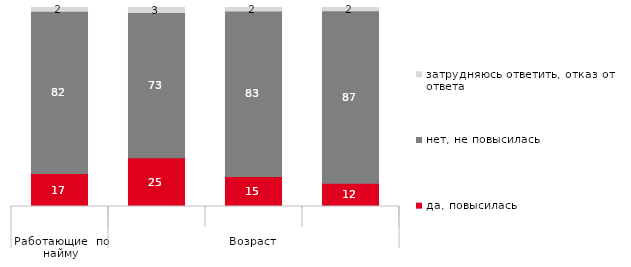
| Category | да, повысилась | нет, не повысилась | затрудняюсь ответить, отказ от ответа |
|---|---|---|---|
| 0 | 16.523 | 81.566 | 1.91 |
| 1 | 24.549 | 72.924 | 2.527 |
| 2 | 15.085 | 83.212 | 1.703 |
| 3 | 11.628 | 86.711 | 1.661 |